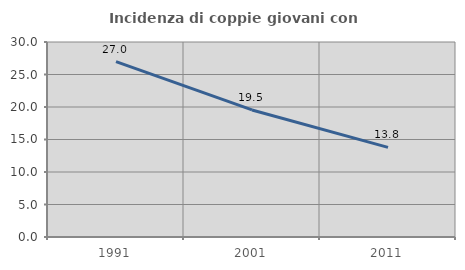
| Category | Incidenza di coppie giovani con figli |
|---|---|
| 1991.0 | 26.983 |
| 2001.0 | 19.545 |
| 2011.0 | 13.796 |